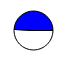
| Category | Series 0 |
|---|---|
| 0 | 50554 |
| 1 | 48826 |